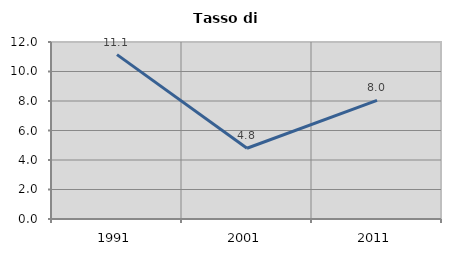
| Category | Tasso di disoccupazione   |
|---|---|
| 1991.0 | 11.145 |
| 2001.0 | 4.798 |
| 2011.0 | 8.038 |